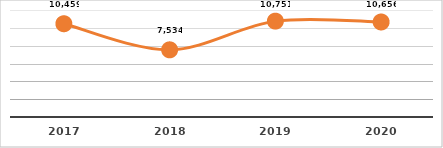
| Category | CERTIFICACIÓN DE COMPETENCIAS (%)
PRIMER TRIMESTRE, EJERCICIO 2020 |
|---|---|
| 2017.0 | 10459 |
| 2018.0 | 7534 |
| 2019.0 | 10751 |
| 2020.0 | 10656 |